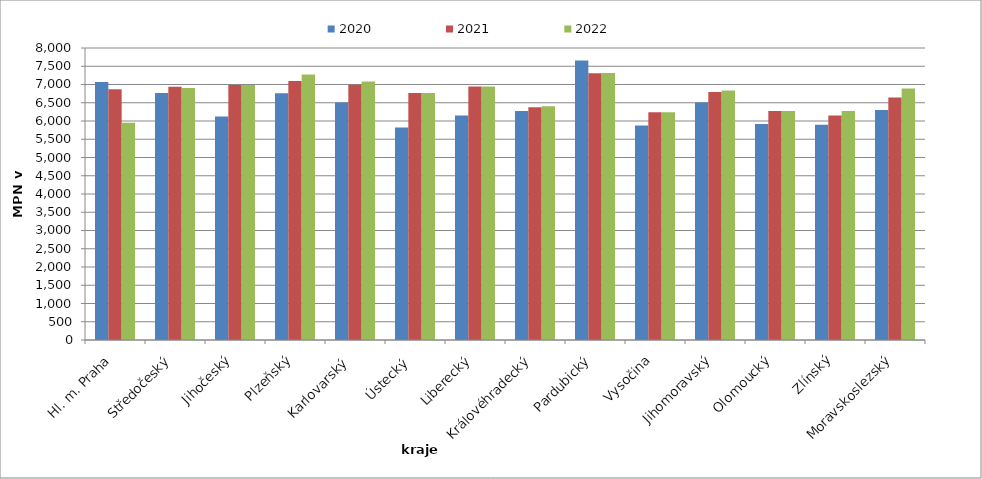
| Category | 2020 | 2021 | 2022 |
|---|---|---|---|
| Hl. m. Praha | 7071 | 6867 | 5949 |
| Středočeský | 6766 | 6937 | 6903 |
| Jihočeský | 6121 | 6987 | 6987 |
| Plzeňský | 6760 | 7098 | 7277 |
| Karlovarský  | 6504 | 6994 | 7080 |
| Ústecký   | 5819 | 6767 | 6767 |
| Liberecký | 6150 | 6946 | 6946 |
| Královéhradecký | 6274 | 6374 | 6406 |
| Pardubický | 7656 | 7309 | 7318 |
| Vysočina | 5878 | 6238 | 6243 |
| Jihomoravský | 6509 | 6792 | 6838 |
| Olomoucký | 5920 | 6275 | 6275 |
| Zlínský | 5895 | 6154 | 6275 |
| Moravskoslezský | 6304 | 6641 | 6891 |